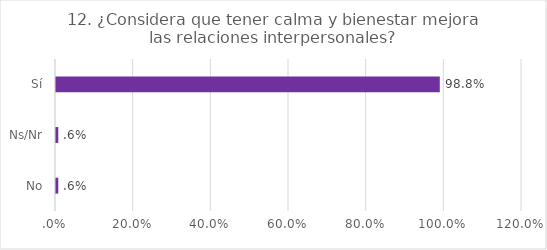
| Category | Series 0 |
|---|---|
| No | 0.006 |
| Ns/Nr | 0.006 |
| Sí | 0.988 |